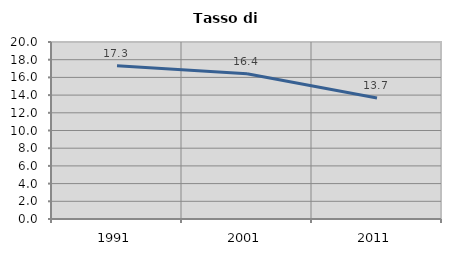
| Category | Tasso di disoccupazione   |
|---|---|
| 1991.0 | 17.325 |
| 2001.0 | 16.422 |
| 2011.0 | 13.67 |